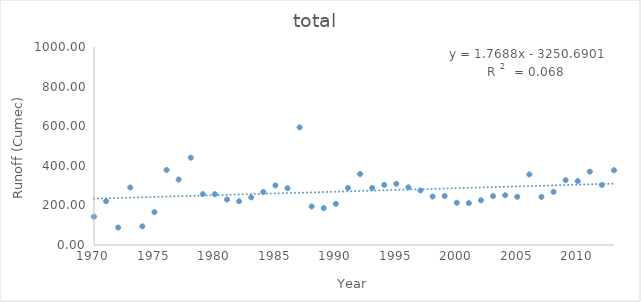
| Category | total  |
|---|---|
| 1970.0 | 142.962 |
| 1971.0 | 221.269 |
| 1972.0 | 88.332 |
| 1973.0 | 290.484 |
| 1974.0 | 94.081 |
| 1975.0 | 165.93 |
| 1976.0 | 379.383 |
| 1977.0 | 330.728 |
| 1978.0 | 440.952 |
| 1979.0 | 256.981 |
| 1980.0 | 256.585 |
| 1981.0 | 229.989 |
| 1982.0 | 220.957 |
| 1983.0 | 240.668 |
| 1984.0 | 267.488 |
| 1985.0 | 300.765 |
| 1986.0 | 286.576 |
| 1987.0 | 593.911 |
| 1988.0 | 194.65 |
| 1989.0 | 186.26 |
| 1990.0 | 208 |
| 1991.0 | 288.226 |
| 1992.0 | 358.552 |
| 1993.0 | 287.983 |
| 1994.0 | 303.631 |
| 1995.0 | 309.221 |
| 1996.0 | 291.071 |
| 1997.0 | 275.357 |
| 1998.0 | 244.818 |
| 1999.0 | 247.576 |
| 2000.0 | 213.349 |
| 2001.0 | 211.585 |
| 2002.0 | 225.835 |
| 2003.0 | 247.106 |
| 2004.0 | 251.319 |
| 2005.0 | 243.17 |
| 2006.0 | 356.471 |
| 2007.0 | 243 |
| 2008.0 | 268.281 |
| 2009.0 | 327.236 |
| 2010.0 | 322.798 |
| 2011.0 | 370.576 |
| 2012.0 | 303.062 |
| 2013.0 | 377.649 |